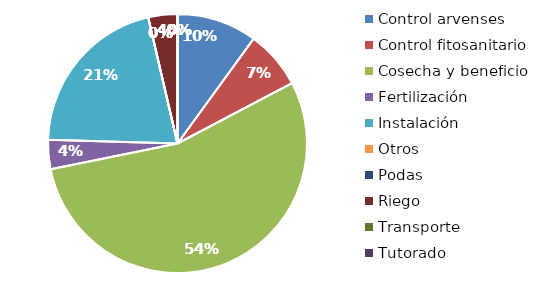
| Category | Valor |
|---|---|
| Control arvenses | 275000 |
| Control fitosanitario | 200000 |
| Cosecha y beneficio | 1500000 |
| Fertilización | 100000 |
| Instalación | 575000 |
| Otros | 0 |
| Podas | 0 |
| Riego | 100000 |
| Transporte | 0 |
| Tutorado | 0 |